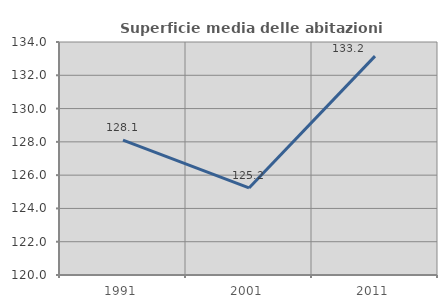
| Category | Superficie media delle abitazioni occupate |
|---|---|
| 1991.0 | 128.1 |
| 2001.0 | 125.232 |
| 2011.0 | 133.153 |